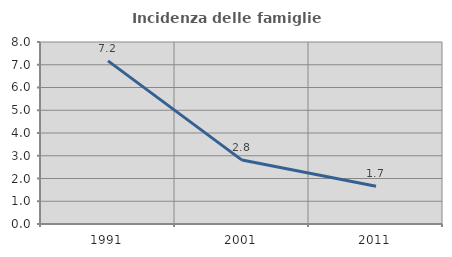
| Category | Incidenza delle famiglie numerose |
|---|---|
| 1991.0 | 7.171 |
| 2001.0 | 2.809 |
| 2011.0 | 1.657 |